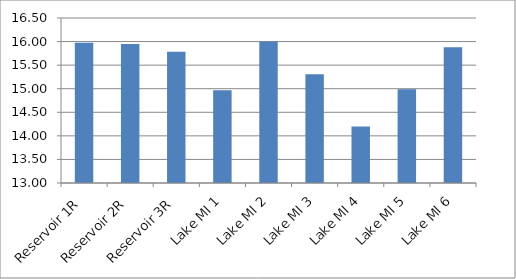
| Category | Mean (°C) |
|---|---|
| Reservoir 1R | 15.972 |
| Reservoir 2R | 15.95 |
| Reservoir 3R | 15.782 |
| Lake MI 1 | 14.967 |
| Lake MI 2 | 16.001 |
| Lake MI 3 | 15.308 |
| Lake MI 4 | 14.2 |
| Lake MI 5 | 14.987 |
| Lake MI 6 | 15.882 |